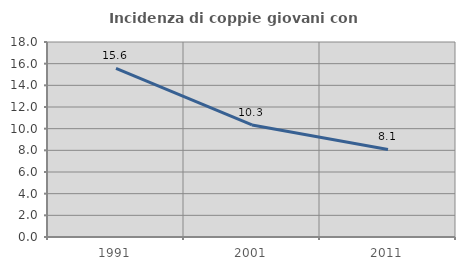
| Category | Incidenza di coppie giovani con figli |
|---|---|
| 1991.0 | 15.566 |
| 2001.0 | 10.342 |
| 2011.0 | 8.08 |